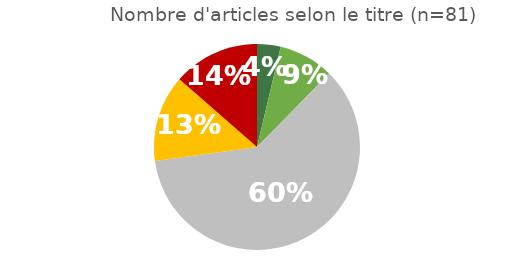
| Category | Series 0 |
|---|---|
| 0.13580246913580246 | 0.037 |
| 0.13580246913580246 | 0.086 |
| 0.08641975308641975 | 0.605 |
| 0.037037037037037035 | 0.136 |
| 0.6049382716049383 | 0.136 |